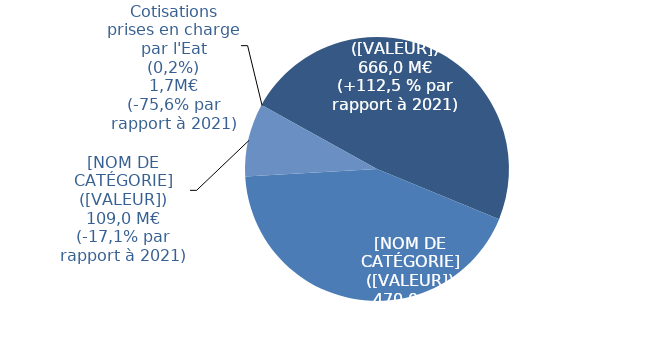
| Category | Series 0 |
|---|---|
| ITAF | 0.481 |
| Contributions Régime général | 0 |
| Compensation démographique | 0 |
| Cotisations sociales | 0.429 |
| Autres produits** | 0.09 |
| Prise en charge de prestations* | 0 |
| Contribution Sociale Généralisée | 0 |
| Cotisations prises en charge par l'Etat | 0 |